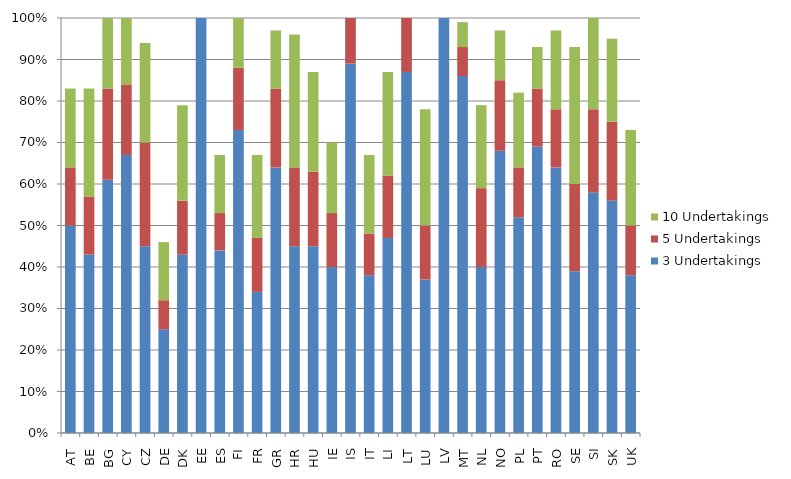
| Category | 3 Undertakings | 5 Undertakings | 10 Undertakings |
|---|---|---|---|
| AT | 0.5 | 0.14 | 0.19 |
| BE | 0.43 | 0.14 | 0.26 |
| BG | 0.61 | 0.22 | 0.17 |
| CY | 0.67 | 0.17 | 0.16 |
| CZ | 0.45 | 0.25 | 0.24 |
| DE | 0.25 | 0.07 | 0.14 |
| DK | 0.43 | 0.13 | 0.23 |
| EE | 1 | 0 | 0 |
| ES | 0.44 | 0.09 | 0.14 |
| FI | 0.73 | 0.15 | 0.12 |
| FR | 0.34 | 0.13 | 0.2 |
| GR | 0.64 | 0.19 | 0.14 |
| HR | 0.45 | 0.19 | 0.32 |
| HU | 0.45 | 0.18 | 0.24 |
| IE | 0.4 | 0.13 | 0.17 |
| IS | 0.89 | 0.11 | 0 |
| IT | 0.38 | 0.1 | 0.19 |
| LI | 0.47 | 0.15 | 0.25 |
| LT | 0.87 | 0.13 | 0 |
| LU | 0.37 | 0.13 | 0.28 |
| LV | 1 | 0 | 0 |
| MT | 0.86 | 0.07 | 0.06 |
| NL | 0.4 | 0.19 | 0.2 |
| NO | 0.68 | 0.17 | 0.12 |
| PL | 0.52 | 0.12 | 0.18 |
| PT | 0.69 | 0.14 | 0.1 |
| RO | 0.64 | 0.14 | 0.19 |
| SE | 0.39 | 0.21 | 0.33 |
| SI | 0.58 | 0.2 | 0.23 |
| SK | 0.56 | 0.19 | 0.2 |
| UK | 0.38 | 0.12 | 0.23 |